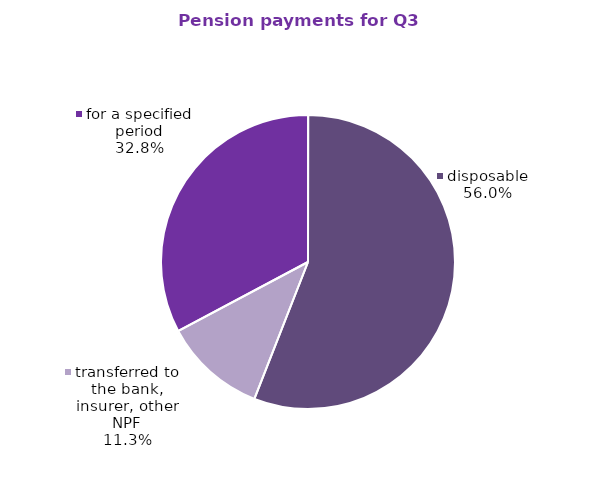
| Category | Series 0 |
|---|---|
| for a specified period | 7.97 |
| disposable | 13.592 |
| transferred to the bank, insurer, other NPF | 2.741 |